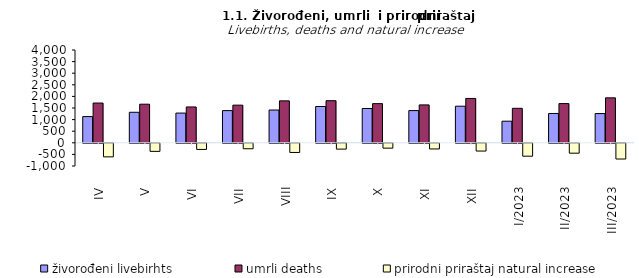
| Category | živorođeni livebirhts | umrli deaths | prirodni priraštaj natural increase |
|---|---|---|---|
| IV | 1130 | 1714 | -584 |
| V | 1316 | 1664 | -348 |
| VI | 1281 | 1545 | -264 |
| VII | 1388 | 1623 | -235 |
| VIII | 1413 | 1808 | -395 |
| IX | 1564 | 1815 | -251 |
| X | 1479 | 1688 | -209 |
| XI | 1389 | 1633 | -244 |
| XII | 1578 | 1912 | -334 |
| I/2023 | 931 | 1487 | -556 |
| II/2023 | 1264 | 1690 | -426 |
| III/2023 | 1260 | 1938 | -678 |